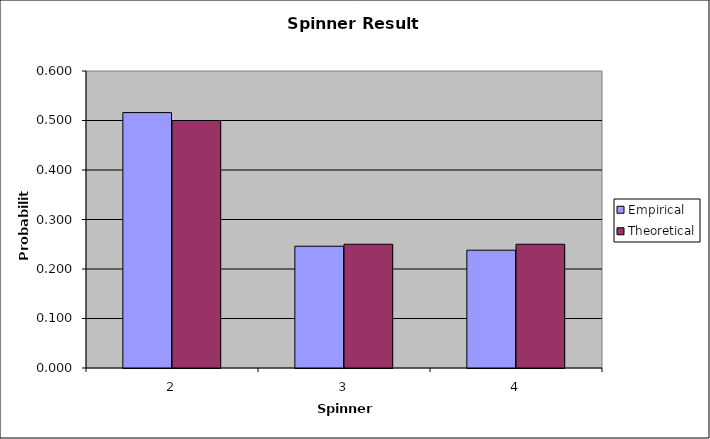
| Category | Empirical | Theoretical |
|---|---|---|
| 2.0 | 0.516 | 0.5 |
| 3.0 | 0.246 | 0.25 |
| 4.0 | 0.238 | 0.25 |